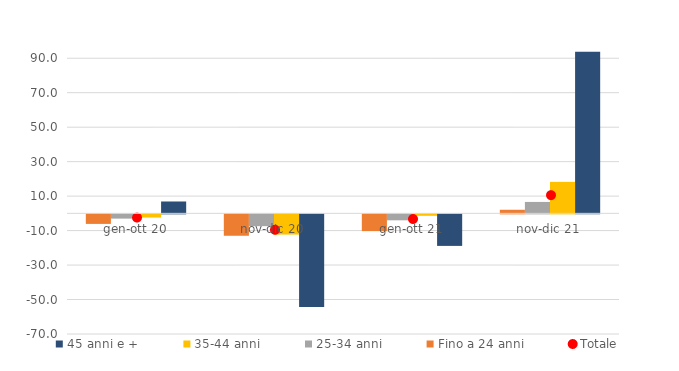
| Category | Fino a 24 anni | 25-34 anni | 35-44 anni | 45 anni e + |
|---|---|---|---|---|
| gen-ott 20 | -5.536 | -2.475 | -1.849 | 6.886 |
| nov-dic 20 | -12.425 | -6.846 | -11.735 | -53.748 |
| gen-ott 21 | -9.716 | -3.446 | -0.832 | -18.306 |
| nov-dic 21 | 2.08 | 6.626 | 18.261 | 93.805 |